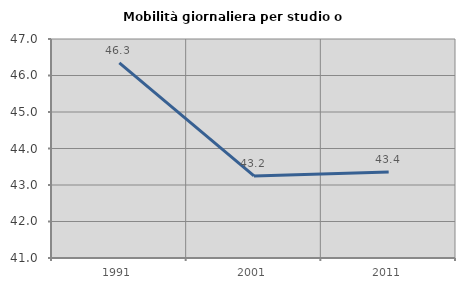
| Category | Mobilità giornaliera per studio o lavoro |
|---|---|
| 1991.0 | 46.344 |
| 2001.0 | 43.25 |
| 2011.0 | 43.357 |